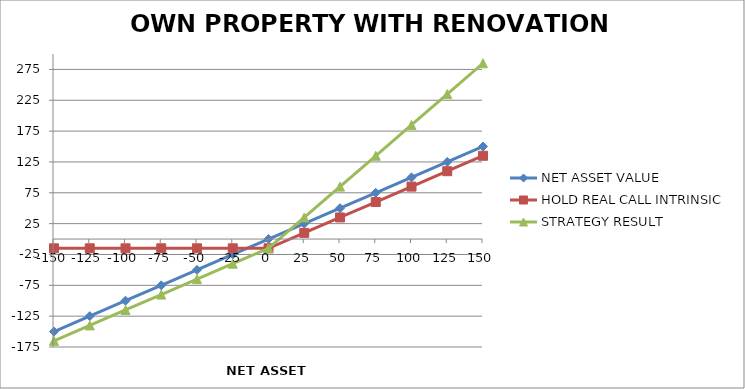
| Category | NET ASSET VALUE | HOLD REAL CALL INTRINSIC | STRATEGY RESULT |
|---|---|---|---|
| -150.0 | -150 | -15 | -165 |
| -125.0 | -125 | -15 | -140 |
| -100.0 | -100 | -15 | -115 |
| -75.0 | -75 | -15 | -90 |
| -50.0 | -50 | -15 | -65 |
| -25.0 | -25 | -15 | -40 |
| 0.0 | 0 | -15 | -15 |
| 25.0 | 25 | 10 | 35 |
| 50.0 | 50 | 35 | 85 |
| 75.0 | 75 | 60 | 135 |
| 100.0 | 100 | 85 | 185 |
| 125.0 | 125 | 110 | 235 |
| 150.0 | 150 | 135 | 285 |